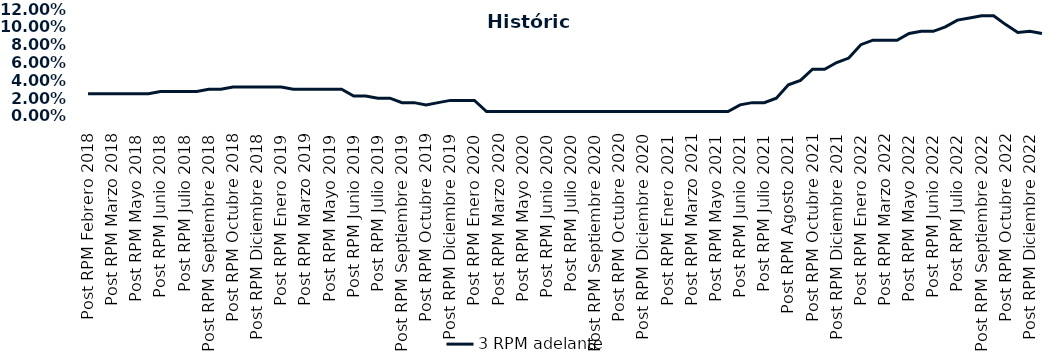
| Category | 3 RPM adelante |
|---|---|
| Post RPM Febrero 2018 | 0.025 |
| Pre RPM Marzo 2018 | 0.025 |
| Post RPM Marzo 2018 | 0.025 |
| Pre RPM Mayo 2018 | 0.025 |
| Post RPM Mayo 2018 | 0.025 |
| Pre RPM Junio 2018 | 0.025 |
| Post RPM Junio 2018 | 0.028 |
| Pre RPM Julio 2018 | 0.028 |
| Post RPM Julio 2018 | 0.028 |
| Pre RPM Septiembre 2018 | 0.028 |
| Post RPM Septiembre 2018 | 0.03 |
| Pre RPM Octubre 2018 | 0.03 |
| Post RPM Octubre 2018 | 0.032 |
| Pre RPM Diciembre 2018 | 0.032 |
| Post RPM Diciembre 2018 | 0.032 |
| Pre RPM Enero 2019 | 0.032 |
| Post RPM Enero 2019 | 0.032 |
| Pre RPM Marzo 2019 | 0.03 |
| Post RPM Marzo 2019 | 0.03 |
| Pre RPM Mayo 2019 | 0.03 |
| Post RPM Mayo 2019 | 0.03 |
| Pre RPM Junio 2019 | 0.03 |
| Post RPM Junio 2019 | 0.022 |
| Pre RPM Julio 2019 | 0.022 |
| Post RPM Julio 2019 | 0.02 |
| Pre RPM Septiembre 2019 | 0.02 |
| Post RPM Septiembre 2019 | 0.015 |
| Pre RPM Octubre 2019 | 0.015 |
| Post RPM Octubre 2019 | 0.012 |
| Pre RPM Diciembre 2019 | 0.015 |
| Post RPM Diciembre 2019 | 0.018 |
| Pre RPM Enero 2020 | 0.018 |
| Post RPM Enero 2020 | 0.018 |
| Pre RPM Marzo 2020 | 0.005 |
| Post RPM Marzo 2020 | 0.005 |
| Pre RPM Mayo 2020 | 0.005 |
| Post RPM Mayo 2020 | 0.005 |
| Pre RPM Junio 2020 | 0.005 |
| Post RPM Junio 2020 | 0.005 |
| Pre RPM Julio 2020 | 0.005 |
| Post RPM Julio 2020 | 0.005 |
| Pre RPM Septiembre 2020 | 0.005 |
| Post RPM Septiembre 2020 | 0.005 |
| Pre RPM Octubre 2020 | 0.005 |
| Post RPM Octubre 2020 | 0.005 |
| Pre RPM Diciembre 2020 | 0.005 |
| Post RPM Diciembre 2020 | 0.005 |
| Pre RPM Enero 2021 | 0.005 |
| Post RPM Enero 2021 | 0.005 |
| Pre RPM Marzo 2021 | 0.005 |
| Post RPM Marzo 2021 | 0.005 |
| Pre RPM Mayo 2021 | 0.005 |
| Post RPM Mayo 2021 | 0.005 |
| Pre RPM Junio 2021 | 0.005 |
| Post RPM Junio 2021 | 0.012 |
| Pre RPM Julio 2021 | 0.015 |
| Post RPM Julio 2021 | 0.015 |
| Pre RPM Agosto 2021 | 0.02 |
| Post RPM Agosto 2021 | 0.035 |
| Pre RPM Octubre 2021 | 0.04 |
| Post RPM Octubre 2021 | 0.052 |
| Pre RPM Diciembre 2021 | 0.052 |
| Post RPM Diciembre 2021 | 0.06 |
| Pre RPM Enero 2022 | 0.065 |
| Post RPM Enero 2022 | 0.08 |
| Pre RPM Marzo 2022 | 0.085 |
| Post RPM Marzo 2022 | 0.085 |
| Pre RPM Mayo 2022 | 0.085 |
| Post RPM Mayo 2022 | 0.092 |
| Pre RPM Junio 2022 | 0.095 |
| Post RPM Junio 2022 | 0.095 |
| Pre RPM Julio 2022 | 0.1 |
| Post RPM Julio 2022 | 0.108 |
| Pre RPM Septiembre 2022 | 0.11 |
| Post RPM Septiembre 2022 | 0.112 |
| Pre RPM Octubre 2022 | 0.112 |
| Post RPM Octubre 2022 | 0.102 |
| Pre RPM Diciembre 2022 | 0.094 |
| Post RPM Diciembre 2022 | 0.095 |
| Pre RPM Enero 2023 | 0.092 |